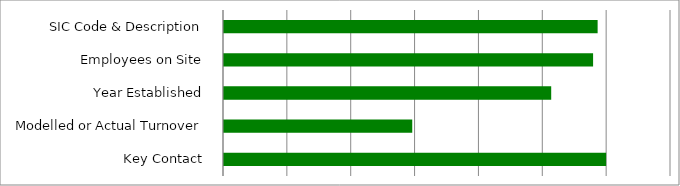
| Category | Series 0 |
|---|---|
|  SIC Code & Description  | 5851 |
|  Employees on Site  | 5780 |
|  Year Established  | 5124 |
|  Modelled or Actual Turnover  | 2948 |
|  Key Contact  | 5984 |